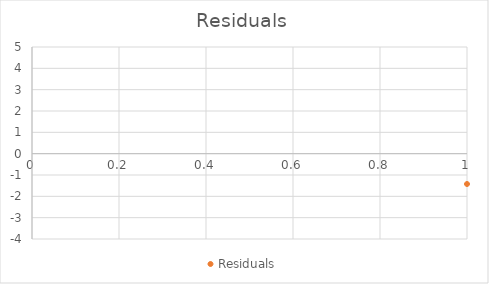
| Category | Residuals |
|---|---|
| 0 | -1.422 |
| 1 | -0.353 |
| 2 | 4.582 |
| 3 | -0.026 |
| 4 | 0.2 |
| 5 | 0.377 |
| 6 | 4.192 |
| 7 | 2.61 |
| 8 | -1.978 |
| 9 | -0.868 |
| 10 | -3.003 |
| 11 | 1.975 |
| 12 | 1.735 |
| 13 | -0.916 |
| 14 | -2.587 |
| 15 | 0.023 |
| 16 | -1.499 |
| 17 | 3.065 |
| 18 | -2.965 |
| 19 | -0.662 |
| 20 | -0.565 |
| 21 | 1.126 |
| 22 | -0.222 |
| 23 | -1.549 |
| 24 | 1.367 |
| 25 | -2.638 |